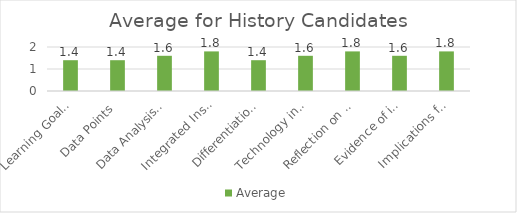
| Category | Average |
|---|---|
| Learning Goals Aligned with Pre-/Post-assessments ACEI 4.0 | 1.4 |
| Data Points | 1.4 |
| Data Analysis for Pedagogical Decisions ACEI 4.0 | 1.6 |
| Integrated Instruction ACEI 3.1 | 1.8 |
| Differentiation based on knowledge of individual learning ACEI 3.2 | 1.4 |
| Technology integration | 1.6 |
| Reflection on pedagogical decisions ACEI 1.0 | 1.8 |
| Evidence of impact on student learning ACEI 5.1 | 1.6 |
| Implications for teaching and professional development ACEI 5.1 | 1.8 |